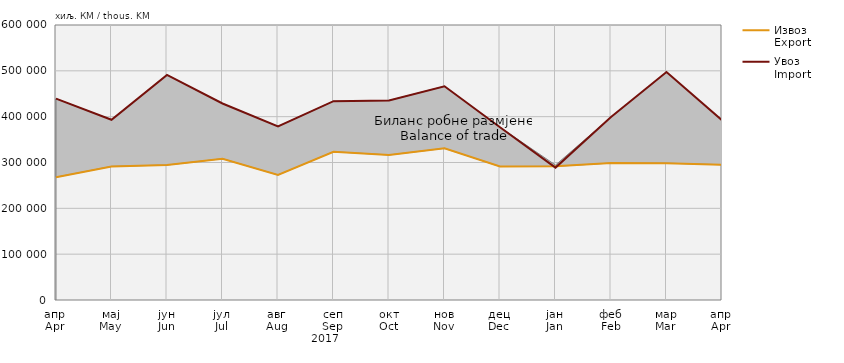
| Category | Извоз
Export | Увоз
Import |
|---|---|---|
| апр
Apr | 267973 | 439231 |
| мај
May | 291490 | 393257 |
| јун
Jun | 294506 | 491152 |
| јул
Jul | 308275 | 428722 |
| авг
Aug | 272830 | 378735 |
| сеп
Sep | 323479 | 433731 |
| окт
Oct | 316474 | 435293 |
| нов
Nov | 330900 | 466301 |
| дец
Dec | 291210 | 376925 |
| јан
Jan | 291617 | 288848 |
| феб
Feb | 298790 | 399118 |
| мар
Mar | 298559 | 497279 |
| апр
Apr | 295094 | 392137 |